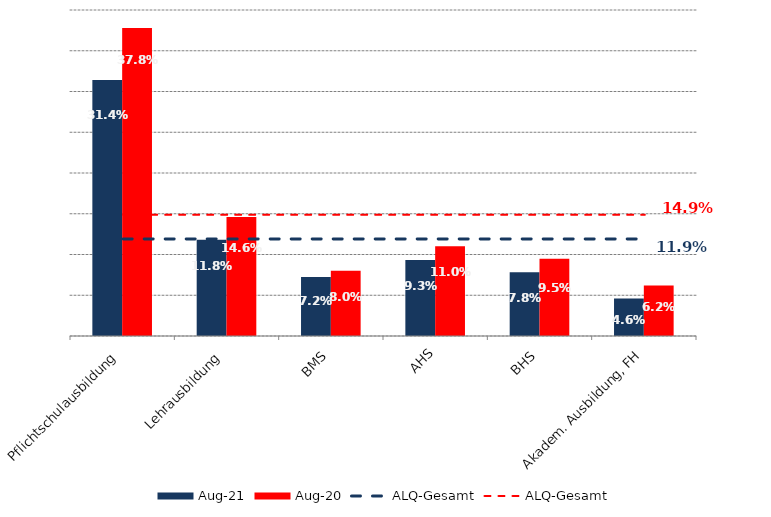
| Category | Aug 21 | Aug 20 |
|---|---|---|
| Pflichtschulausbildung | 0.314 | 0.378 |
| Lehrausbildung | 0.118 | 0.146 |
| BMS | 0.072 | 0.08 |
| AHS | 0.093 | 0.11 |
| BHS | 0.078 | 0.095 |
| Akadem. Ausbildung, FH | 0.046 | 0.062 |